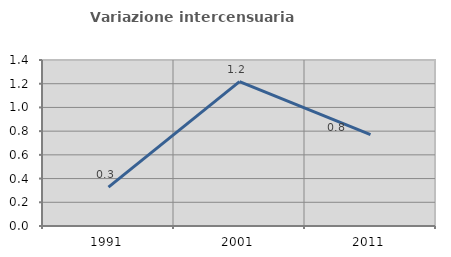
| Category | Variazione intercensuaria annua |
|---|---|
| 1991.0 | 0.327 |
| 2001.0 | 1.217 |
| 2011.0 | 0.77 |